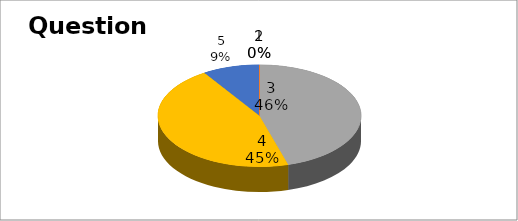
| Category | Series 0 |
|---|---|
| 0 | 0 |
| 1 | 0 |
| 2 | 10 |
| 3 | 10 |
| 4 | 2 |